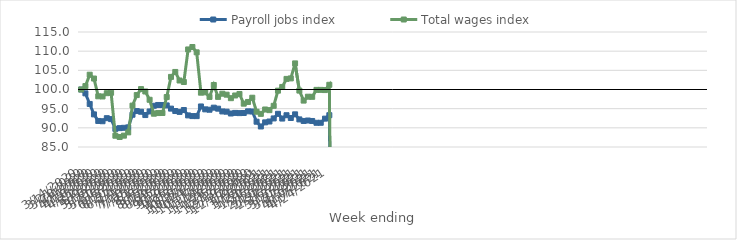
| Category | Payroll jobs index | Total wages index |
|---|---|---|
| 14/03/2020 | 100 | 100 |
| 21/03/2020 | 98.993 | 100.894 |
| 28/03/2020 | 96.232 | 103.86 |
| 04/04/2020 | 93.51 | 102.86 |
| 11/04/2020 | 91.794 | 98.227 |
| 18/04/2020 | 91.722 | 98.181 |
| 25/04/2020 | 92.517 | 99.038 |
| 02/05/2020 | 92.276 | 99.152 |
| 09/05/2020 | 89.73 | 87.943 |
| 16/05/2020 | 89.924 | 87.608 |
| 23/05/2020 | 90.008 | 87.963 |
| 30/05/2020 | 90.112 | 88.812 |
| 06/06/2020 | 93.42 | 95.796 |
| 13/06/2020 | 94.379 | 98.546 |
| 20/06/2020 | 94.197 | 100.101 |
| 27/06/2020 | 93.333 | 99.481 |
| 04/07/2020 | 94.271 | 97.32 |
| 11/07/2020 | 95.756 | 93.686 |
| 18/07/2020 | 95.964 | 93.854 |
| 25/07/2020 | 95.947 | 93.873 |
| 01/08/2020 | 95.851 | 98.033 |
| 08/08/2020 | 95.014 | 103.288 |
| 15/08/2020 | 94.383 | 104.578 |
| 22/08/2020 | 94.16 | 102.345 |
| 29/08/2020 | 94.646 | 101.956 |
| 05/09/2020 | 93.243 | 110.448 |
| 12/09/2020 | 93.064 | 111.084 |
| 19/09/2020 | 93.055 | 109.695 |
| 26/09/2020 | 95.576 | 99.171 |
| 03/10/2020 | 94.821 | 99.26 |
| 10/10/2020 | 94.723 | 98.068 |
| 17/10/2020 | 95.26 | 101.173 |
| 24/10/2020 | 95 | 98.073 |
| 31/10/2020 | 94.276 | 98.905 |
| 07/11/2020 | 94.209 | 98.648 |
| 14/11/2020 | 93.737 | 97.734 |
| 21/11/2020 | 93.893 | 98.443 |
| 28/11/2020 | 93.841 | 98.836 |
| 05/12/2020 | 93.869 | 96.306 |
| 12/12/2020 | 94.305 | 96.748 |
| 19/12/2020 | 94.259 | 97.854 |
| 26/12/2020 | 91.598 | 94.199 |
| 02/01/2021 | 90.356 | 93.644 |
| 09/01/2021 | 91.424 | 94.785 |
| 16/01/2021 | 91.651 | 94.615 |
| 23/01/2021 | 92.454 | 95.744 |
| 30/01/2021 | 93.657 | 99.696 |
| 06/02/2021 | 92.422 | 100.665 |
| 13/02/2021 | 93.289 | 102.764 |
| 20/02/2021 | 92.562 | 102.895 |
| 27/02/2021 | 93.516 | 106.808 |
| 06/03/2021 | 92.201 | 99.713 |
| 13/03/2021 | 91.793 | 97.105 |
| 20/03/2021 | 91.912 | 98.12 |
| 27/03/2021 | 91.787 | 98.089 |
| 03/04/2021 | 91.317 | 99.901 |
| 10/04/2021 | 91.317 | 99.901 |
| 17/04/2021 | 92.4 | 99.851 |
| 24/04/2021 | 93.296 | 101.23 |